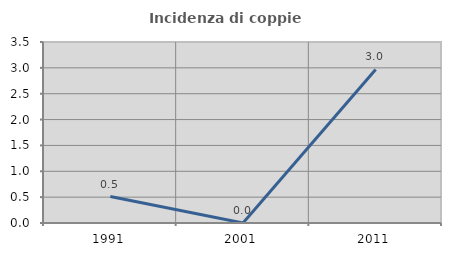
| Category | Incidenza di coppie miste |
|---|---|
| 1991.0 | 0.511 |
| 2001.0 | 0 |
| 2011.0 | 2.968 |